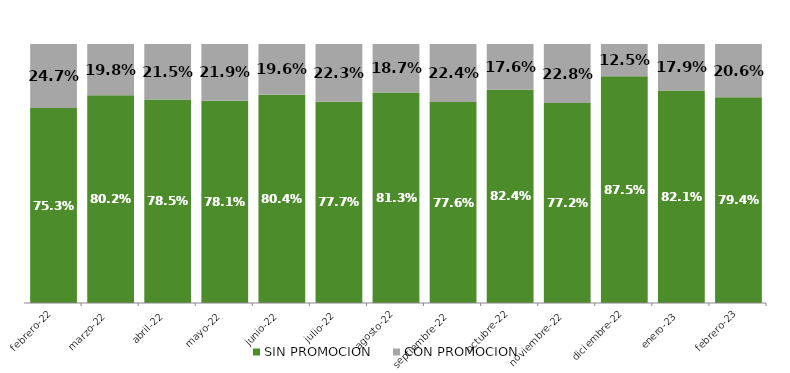
| Category | SIN PROMOCION   | CON PROMOCION   |
|---|---|---|
| 2022-02-01 | 0.753 | 0.247 |
| 2022-03-01 | 0.802 | 0.198 |
| 2022-04-01 | 0.785 | 0.215 |
| 2022-05-01 | 0.781 | 0.219 |
| 2022-06-01 | 0.804 | 0.196 |
| 2022-07-01 | 0.777 | 0.223 |
| 2022-08-01 | 0.813 | 0.187 |
| 2022-09-01 | 0.776 | 0.224 |
| 2022-10-01 | 0.824 | 0.176 |
| 2022-11-01 | 0.772 | 0.228 |
| 2022-12-01 | 0.875 | 0.125 |
| 2023-01-01 | 0.821 | 0.179 |
| 2023-02-01 | 0.794 | 0.206 |